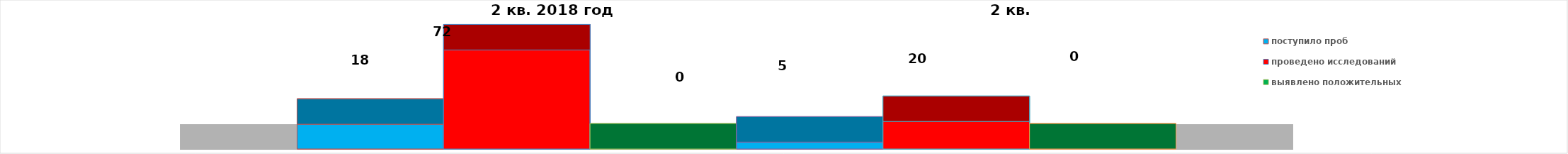
| Category | поступило проб | проведено исследований | выявлено положительных | 2 квартал 2019 год | 2016 год |
|---|---|---|---|---|---|
| 0 | 18 | 72 | 0 | 0 | 20 |